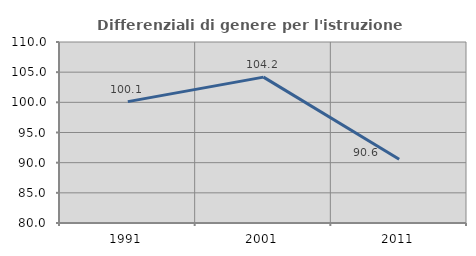
| Category | Differenziali di genere per l'istruzione superiore |
|---|---|
| 1991.0 | 100.115 |
| 2001.0 | 104.179 |
| 2011.0 | 90.566 |